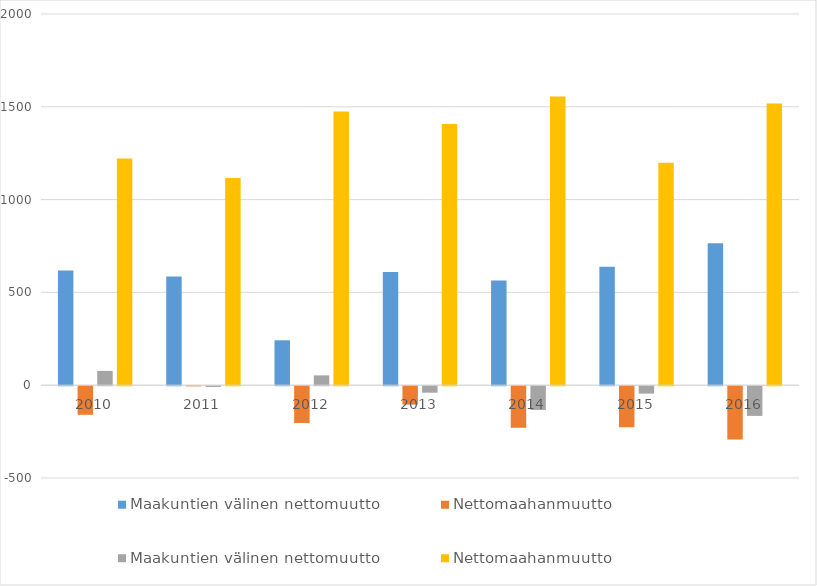
| Category | SUOMALAISTAUSTAISET - Maakuntien välinen nettomuutto | SUOMALAISTAUSTAISET - Nettomaahanmuutto | ULKOMAALAISTAUSTAISET - Maakuntien välinen nettomuutto | ULKOMAALAISTAUSTAISET - Nettomaahanmuutto |
|---|---|---|---|---|
| 2010 | 618 | -154 | 77 | 1222 |
| 2011 | 585 | -1 | -4 | 1117 |
| 2012 | 242 | -198 | 53 | 1475 |
| 2013 | 610 | -99 | -35 | 1408 |
| 2014 | 564 | -224 | -128 | 1556 |
| 2015 | 638 | -221 | -40 | 1199 |
| 2016 | 765 | -287 | -160 | 1518 |